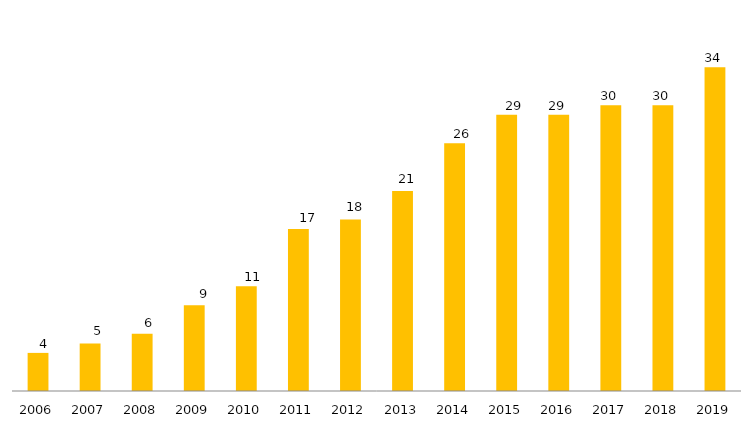
| Category | Pós - Graduação UFGD |
|---|---|
| 2006.0 | 4 |
| 2007.0 | 5 |
| 2008.0 | 6 |
| 2009.0 | 9 |
| 2010.0 | 11 |
| 2011.0 | 17 |
| 2012.0 | 18 |
| 2013.0 | 21 |
| 2014.0 | 26 |
| 2015.0 | 29 |
| 2016.0 | 29 |
| 2017.0 | 30 |
| 2018.0 | 30 |
| 2019.0 | 34 |